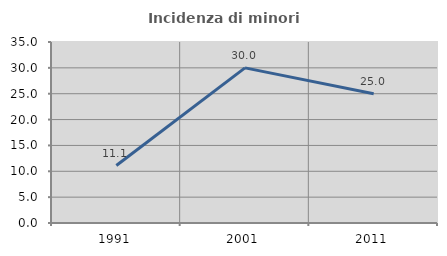
| Category | Incidenza di minori stranieri |
|---|---|
| 1991.0 | 11.111 |
| 2001.0 | 30 |
| 2011.0 | 25 |